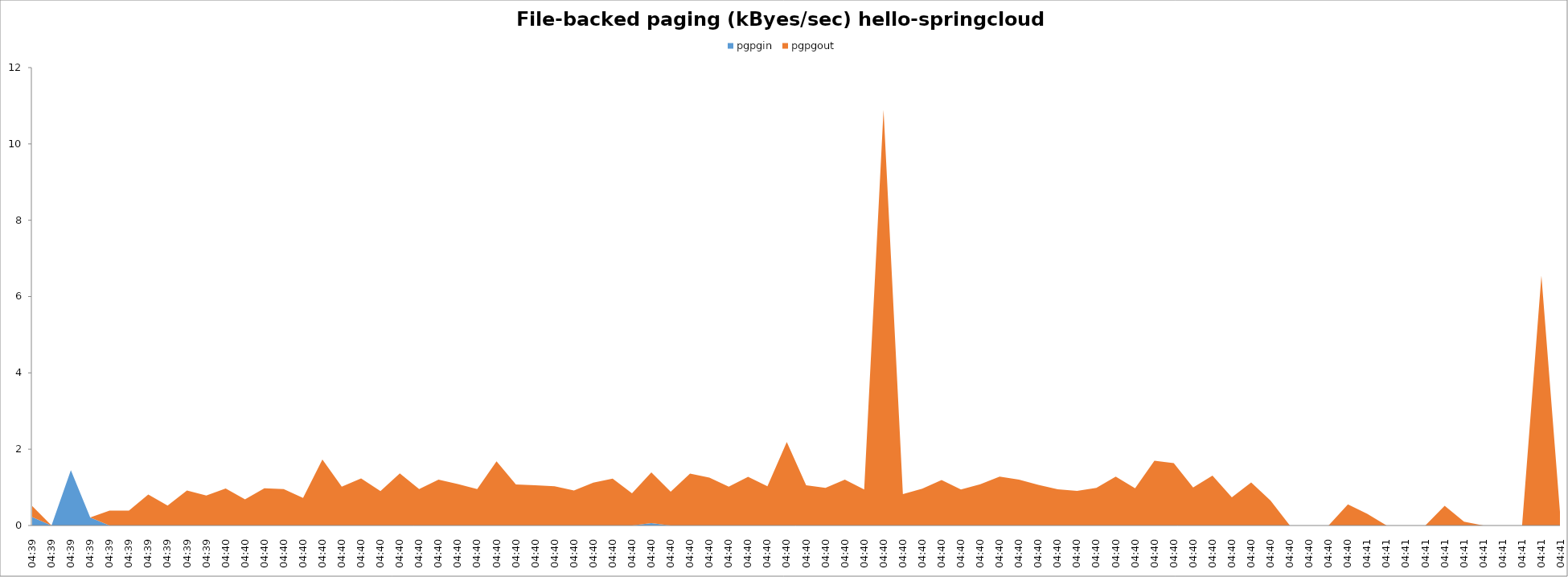
| Category | pgpgin | pgpgout |
|---|---|---|
| 04:39 | 220 | 292 |
| 04:39 | 0 | 0 |
| 04:39 | 1452 | 0 |
| 04:39 | 212 | 0 |
| 04:39 | 0 | 388 |
| 04:39 | 0 | 392 |
| 04:39 | 0 | 812 |
| 04:39 | 0 | 524 |
| 04:39 | 0 | 916 |
| 04:39 | 0 | 788 |
| 04:40 | 0 | 972 |
| 04:40 | 0 | 684 |
| 04:40 | 0 | 976 |
| 04:40 | 0 | 956 |
| 04:40 | 0 | 724 |
| 04:40 | 0 | 1728 |
| 04:40 | 0 | 1020 |
| 04:40 | 0 | 1236 |
| 04:40 | 0 | 900 |
| 04:40 | 0 | 1368 |
| 04:40 | 0 | 956 |
| 04:40 | 0 | 1204 |
| 04:40 | 0 | 1084 |
| 04:40 | 0 | 956 |
| 04:40 | 0 | 1680 |
| 04:40 | 0 | 1076 |
| 04:40 | 0 | 1056 |
| 04:40 | 0 | 1028 |
| 04:40 | 0 | 916 |
| 04:40 | 0 | 1124 |
| 04:40 | 0 | 1228 |
| 04:40 | 0 | 844 |
| 04:40 | 64 | 1328 |
| 04:40 | 0 | 884 |
| 04:40 | 0 | 1360 |
| 04:40 | 0 | 1256 |
| 04:40 | 0 | 1020 |
| 04:40 | 0 | 1276 |
| 04:40 | 0 | 1028 |
| 04:40 | 0 | 2188 |
| 04:40 | 0 | 1056 |
| 04:40 | 0 | 984 |
| 04:40 | 0 | 1200 |
| 04:40 | 0 | 944 |
| 04:40 | 0 | 10892 |
| 04:40 | 0 | 820 |
| 04:40 | 0 | 964 |
| 04:40 | 0 | 1192 |
| 04:40 | 0 | 944 |
| 04:40 | 0 | 1080 |
| 04:40 | 0 | 1280 |
| 04:40 | 0 | 1204 |
| 04:40 | 0 | 1064 |
| 04:40 | 0 | 948 |
| 04:40 | 0 | 908 |
| 04:40 | 0 | 988 |
| 04:40 | 0 | 1280 |
| 04:40 | 0 | 976 |
| 04:40 | 0 | 1696 |
| 04:40 | 0 | 1632 |
| 04:40 | 0 | 996 |
| 04:40 | 0 | 1308 |
| 04:40 | 0 | 736 |
| 04:40 | 0 | 1128 |
| 04:40 | 0 | 652 |
| 04:40 | 0 | 0 |
| 04:40 | 0 | 0 |
| 04:40 | 0 | 0 |
| 04:40 | 0 | 552 |
| 04:41 | 0 | 304 |
| 04:41 | 0 | 0 |
| 04:41 | 0 | 0 |
| 04:41 | 0 | 0 |
| 04:41 | 0 | 516 |
| 04:41 | 0 | 100 |
| 04:41 | 0 | 0 |
| 04:41 | 0 | 0 |
| 04:41 | 0 | 0 |
| 04:41 | 0 | 6548 |
| 04:41 | 0 | 92 |